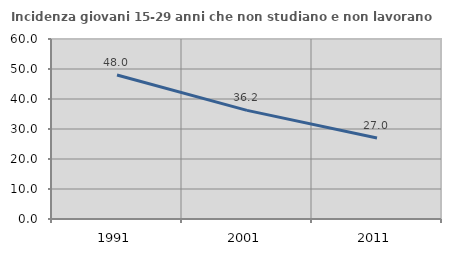
| Category | Incidenza giovani 15-29 anni che non studiano e non lavorano  |
|---|---|
| 1991.0 | 48.017 |
| 2001.0 | 36.211 |
| 2011.0 | 26.994 |